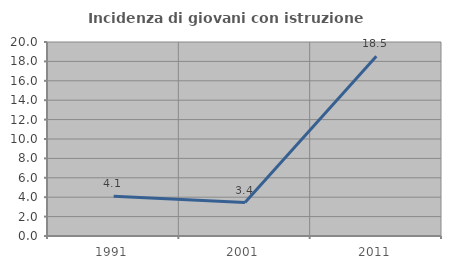
| Category | Incidenza di giovani con istruzione universitaria |
|---|---|
| 1991.0 | 4.11 |
| 2001.0 | 3.448 |
| 2011.0 | 18.519 |